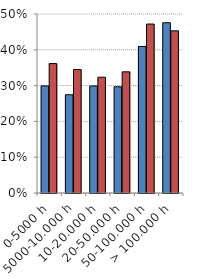
| Category | DF | DIHR |
|---|---|---|
| 0-5000 h | 0.299 | 0.362 |
| 5000-10.000 h | 0.274 | 0.345 |
| 10-20.000 h | 0.299 | 0.323 |
| 20-50.000 h | 0.297 | 0.338 |
| 50-100.000 h | 0.409 | 0.472 |
| > 100.000 h | 0.476 | 0.453 |